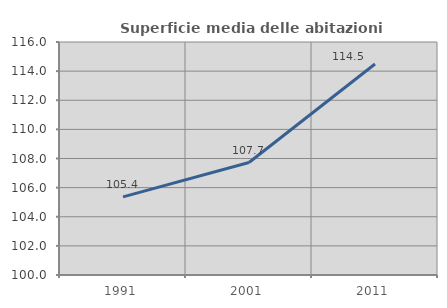
| Category | Superficie media delle abitazioni occupate |
|---|---|
| 1991.0 | 105.363 |
| 2001.0 | 107.725 |
| 2011.0 | 114.487 |